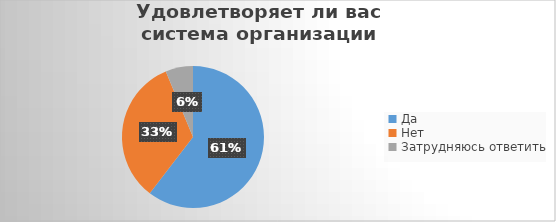
| Category | Series 0 |
|---|---|
| Да | 58 |
| Нет | 32 |
| Затрудняюсь ответить | 6 |